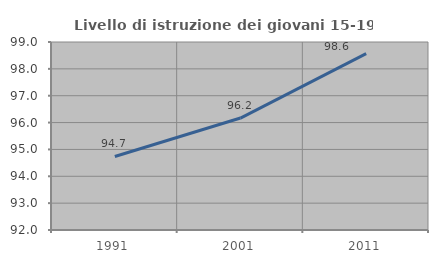
| Category | Livello di istruzione dei giovani 15-19 anni |
|---|---|
| 1991.0 | 94.737 |
| 2001.0 | 96.169 |
| 2011.0 | 98.565 |